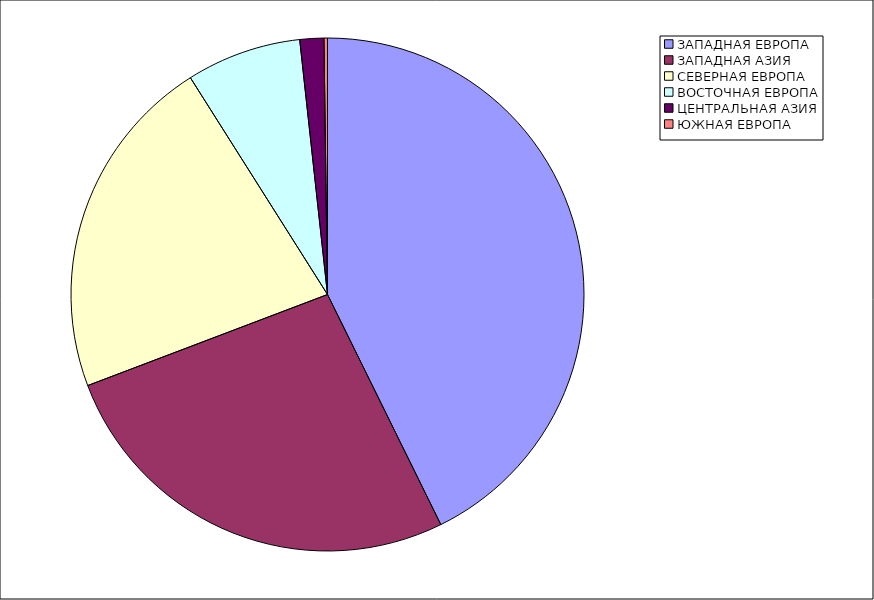
| Category | Оборот |
|---|---|
| ЗАПАДНАЯ ЕВРОПА | 42.715 |
| ЗАПАДНАЯ АЗИЯ | 26.509 |
| СЕВЕРНАЯ ЕВРОПА | 21.799 |
| ВОСТОЧНАЯ ЕВРОПА | 7.246 |
| ЦЕНТРАЛЬНАЯ АЗИЯ | 1.509 |
| ЮЖНАЯ ЕВРОПА | 0.222 |